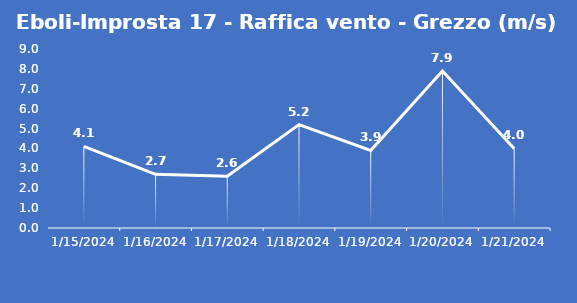
| Category | Eboli-Improsta 17 - Raffica vento - Grezzo (m/s) |
|---|---|
| 1/15/24 | 4.1 |
| 1/16/24 | 2.7 |
| 1/17/24 | 2.6 |
| 1/18/24 | 5.2 |
| 1/19/24 | 3.9 |
| 1/20/24 | 7.9 |
| 1/21/24 | 4 |